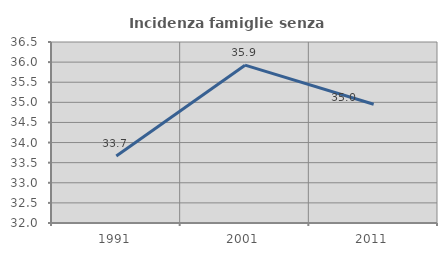
| Category | Incidenza famiglie senza nuclei |
|---|---|
| 1991.0 | 33.663 |
| 2001.0 | 35.924 |
| 2011.0 | 34.951 |